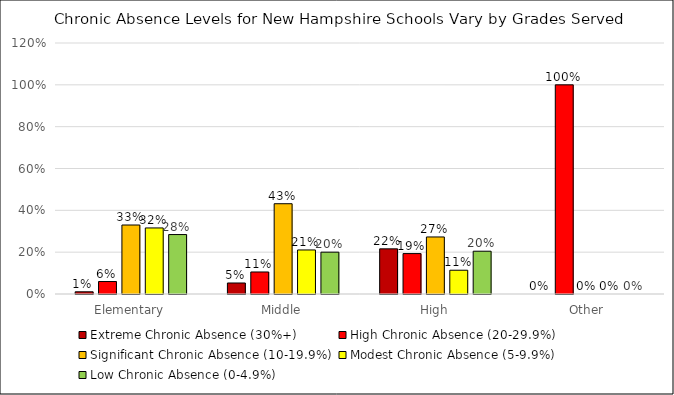
| Category | Extreme Chronic Absence (30%+) | High Chronic Absence (20-29.9%) | Significant Chronic Absence (10-19.9%) | Modest Chronic Absence (5-9.9%) | Low Chronic Absence (0-4.9%) |
|---|---|---|---|---|---|
| Elementary | 0.011 | 0.06 | 0.33 | 0.316 | 0.284 |
| Middle | 0.053 | 0.105 | 0.432 | 0.211 | 0.2 |
| High | 0.216 | 0.193 | 0.273 | 0.114 | 0.205 |
| Other | 0 | 1 | 0 | 0 | 0 |